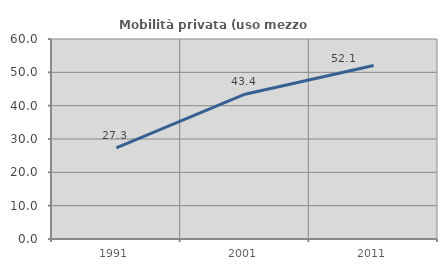
| Category | Mobilità privata (uso mezzo privato) |
|---|---|
| 1991.0 | 27.344 |
| 2001.0 | 43.429 |
| 2011.0 | 52.071 |